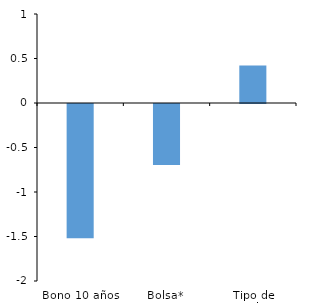
| Category | Series 0 |
|---|---|
| Bono 10 años | -1.508 |
| Bolsa* | -0.685 |
| Tipo de Cambio* | 0.422 |